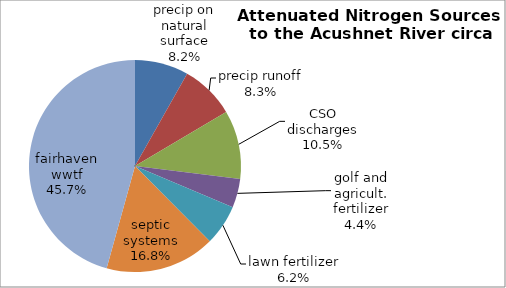
| Category | precip on natural surface precip runoff CSO discharges golf and agricult. fertilizer lawn fertilizer septic systems fairhaven wwtf |
|---|---|
| precip on natural surface | 16690.164 |
| precip runoff | 16893.172 |
| CSO discharges | 21392.906 |
| golf and agricult. fertilizer | 8927.761 |
| lawn fertilizer | 12631.456 |
| septic systems | 34190.499 |
| fairhaven wwtf | 93148 |